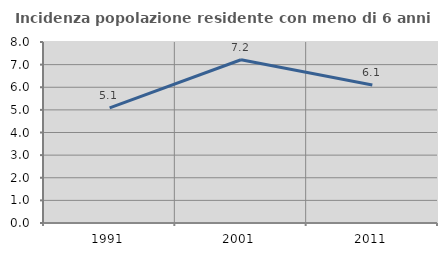
| Category | Incidenza popolazione residente con meno di 6 anni |
|---|---|
| 1991.0 | 5.091 |
| 2001.0 | 7.217 |
| 2011.0 | 6.1 |